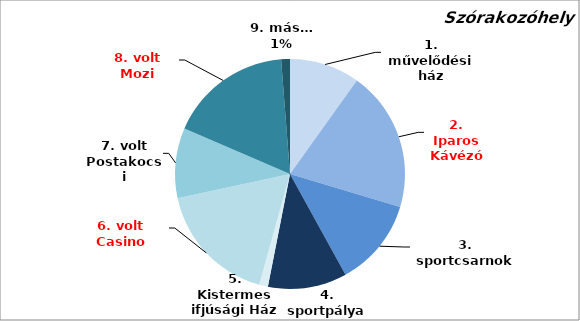
| Category | Series 0 |
|---|---|
| 1. művelődési ház | 8 |
| 2. Iparos Kávézó | 16 |
| 3. sportcsarnok | 10 |
| 4. sportpálya | 9 |
| 5. Kistermes ifjúsági Ház | 1 |
| 6. volt Casino | 14 |
| 7. volt Postakocsi | 8 |
| 8. volt Mozi | 14 |
| 9. más… | 1 |